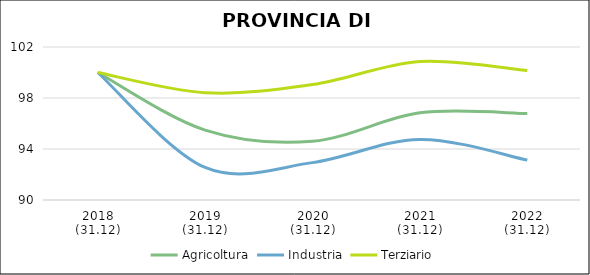
| Category | Agricoltura | Industria | Terziario |
|---|---|---|---|
| 2018
(31.12) | 100 | 100 | 100 |
| 2019
(31.12) | 95.485 | 92.551 | 98.417 |
| 2020
(31.12) | 94.603 | 92.931 | 99.054 |
| 2021
(31.12) | 96.834 | 94.753 | 100.866 |
| 2022
(31.12) | 96.783 | 93.135 | 100.149 |